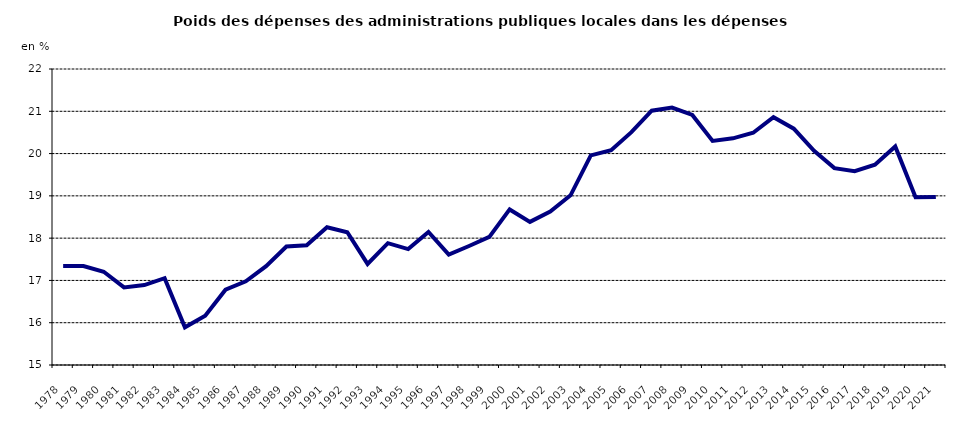
| Category | poids des dépenses des administarations publiques locales dans les administrations publiques |
|---|---|
| 1978.0 | 17.339 |
| 1979.0 | 17.341 |
| 1980.0 | 17.205 |
| 1981.0 | 16.834 |
| 1982.0 | 16.891 |
| 1983.0 | 17.054 |
| 1984.0 | 15.892 |
| 1985.0 | 16.168 |
| 1986.0 | 16.782 |
| 1987.0 | 16.979 |
| 1988.0 | 17.336 |
| 1989.0 | 17.802 |
| 1990.0 | 17.83 |
| 1991.0 | 18.256 |
| 1992.0 | 18.141 |
| 1993.0 | 17.39 |
| 1994.0 | 17.882 |
| 1995.0 | 17.74 |
| 1996.0 | 18.145 |
| 1997.0 | 17.609 |
| 1998.0 | 17.814 |
| 1999.0 | 18.03 |
| 2000.0 | 18.679 |
| 2001.0 | 18.384 |
| 2002.0 | 18.63 |
| 2003.0 | 19.013 |
| 2004.0 | 19.956 |
| 2005.0 | 20.078 |
| 2006.0 | 20.507 |
| 2007.0 | 21.014 |
| 2008.0 | 21.088 |
| 2009.0 | 20.914 |
| 2010.0 | 20.299 |
| 2011.0 | 20.36 |
| 2012.0 | 20.493 |
| 2013.0 | 20.86 |
| 2014.0 | 20.59 |
| 2015.0 | 20.065 |
| 2016.0 | 19.656 |
| 2017.0 | 19.585 |
| 2018.0 | 19.735 |
| 2019.0 | 20.169 |
| 2020.0 | 18.965 |
| 2021.0 | 18.976 |